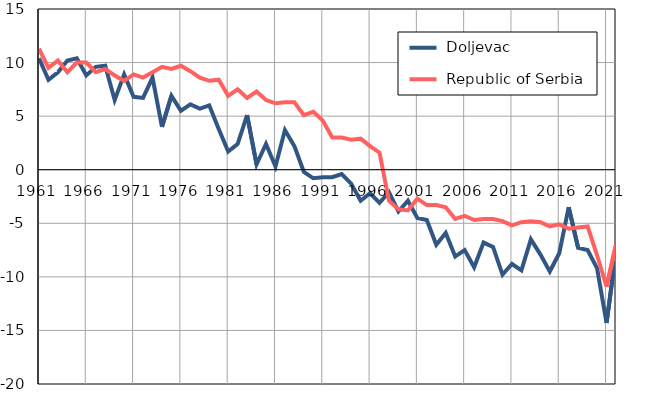
| Category |  Doljevac |  Republic of Serbia |
|---|---|---|
| 1961.0 | 10.4 | 11.3 |
| 1962.0 | 8.4 | 9.5 |
| 1963.0 | 9.1 | 10.2 |
| 1964.0 | 10.2 | 9.1 |
| 1965.0 | 10.4 | 10 |
| 1966.0 | 8.8 | 10 |
| 1967.0 | 9.6 | 9.1 |
| 1968.0 | 9.7 | 9.4 |
| 1969.0 | 6.5 | 8.8 |
| 1970.0 | 8.9 | 8.3 |
| 1971.0 | 6.8 | 8.9 |
| 1972.0 | 6.7 | 8.6 |
| 1973.0 | 8.6 | 9.1 |
| 1974.0 | 4 | 9.6 |
| 1975.0 | 6.9 | 9.4 |
| 1976.0 | 5.5 | 9.7 |
| 1977.0 | 6.1 | 9.2 |
| 1978.0 | 5.7 | 8.6 |
| 1979.0 | 6 | 8.3 |
| 1980.0 | 3.8 | 8.4 |
| 1981.0 | 1.7 | 6.9 |
| 1982.0 | 2.4 | 7.5 |
| 1983.0 | 5.1 | 6.7 |
| 1984.0 | 0.5 | 7.3 |
| 1985.0 | 2.4 | 6.5 |
| 1986.0 | 0.3 | 6.2 |
| 1987.0 | 3.7 | 6.3 |
| 1988.0 | 2.2 | 6.3 |
| 1989.0 | -0.2 | 5.1 |
| 1990.0 | -0.8 | 5.4 |
| 1991.0 | -0.7 | 4.6 |
| 1992.0 | -0.7 | 3 |
| 1993.0 | -0.4 | 3 |
| 1994.0 | -1.3 | 2.8 |
| 1995.0 | -2.9 | 2.9 |
| 1996.0 | -2.2 | 2.2 |
| 1997.0 | -3.1 | 1.6 |
| 1998.0 | -2.1 | -2.9 |
| 1999.0 | -3.9 | -3.7 |
| 2000.0 | -2.9 | -3.8 |
| 2001.0 | -4.5 | -2.7 |
| 2002.0 | -4.7 | -3.3 |
| 2003.0 | -7 | -3.3 |
| 2004.0 | -5.9 | -3.5 |
| 2005.0 | -8.1 | -4.6 |
| 2006.0 | -7.5 | -4.3 |
| 2007.0 | -9.1 | -4.7 |
| 2008.0 | -6.8 | -4.6 |
| 2009.0 | -7.2 | -4.6 |
| 2010.0 | -9.8 | -4.8 |
| 2011.0 | -8.8 | -5.2 |
| 2012.0 | -9.4 | -4.9 |
| 2013.0 | -6.5 | -4.8 |
| 2014.0 | -7.9 | -4.9 |
| 2015.0 | -9.5 | -5.3 |
| 2016.0 | -7.8 | -5.1 |
| 2017.0 | -3.5 | -5.5 |
| 2018.0 | -7.3 | -5.4 |
| 2019.0 | -7.5 | -5.3 |
| 2020.0 | -9.2 | -8 |
| 2021.0 | -14.3 | -10.9 |
| 2022.0 | -7.7 | -7 |